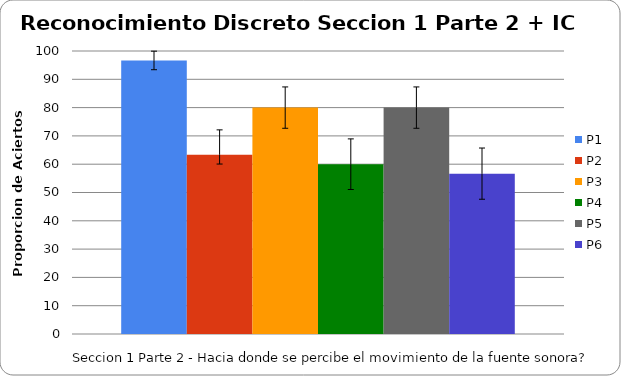
| Category | P1 | P2 | P3 | P4 | P5 | P6 |
|---|---|---|---|---|---|---|
| 0 | 96.667 | 63.333 | 80 | 60 | 80 | 56.667 |